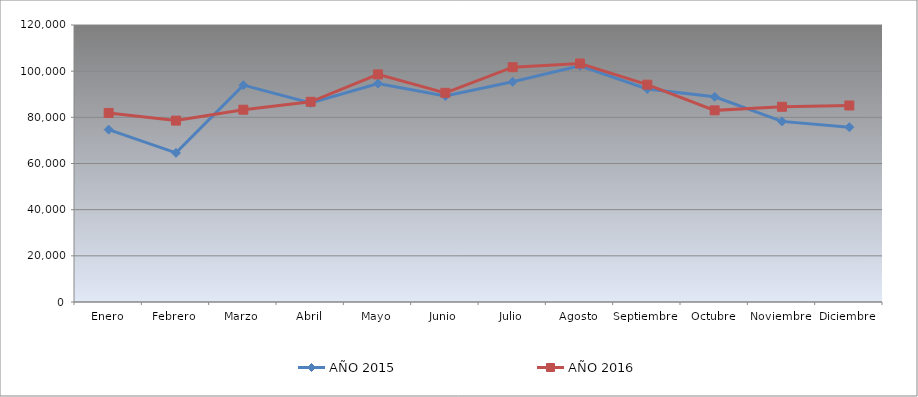
| Category | AÑO 2015 | AÑO 2016 |
|---|---|---|
| Enero | 74690.577 | 81893.302 |
| Febrero | 64616.034 | 78584.687 |
| Marzo | 93937.764 | 83317.563 |
| Abril | 86221.519 | 86741.202 |
| Mayo | 94659.283 | 98602.147 |
| Junio | 89247.89 | 90618.168 |
| Julio | 95380.802 | 101721.312 |
| Agosto | 102308.72 | 103318.108 |
| Septiembre | 92274.262 | 94143.298 |
| Octubre | 88887.131 | 83019.855 |
| Noviembre | 78244.726 | 84589.587 |
| Diciembre | 75719.409 | 85137.64 |